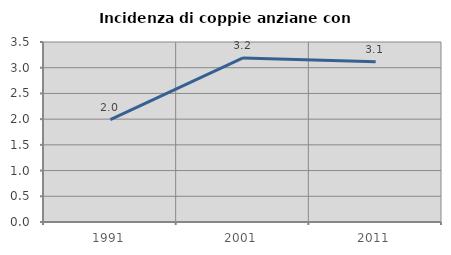
| Category | Incidenza di coppie anziane con figli |
|---|---|
| 1991.0 | 1.991 |
| 2001.0 | 3.19 |
| 2011.0 | 3.118 |